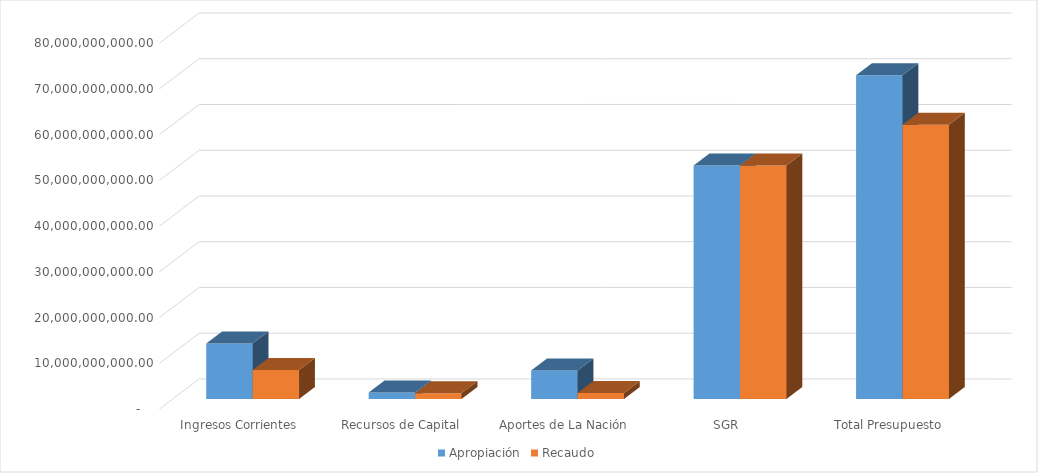
| Category | Apropiación | Recaudo |
|---|---|---|
| Ingresos Corrientes | 12114975818 | 6328537699.14 |
| Recursos de Capital | 1404411861 | 1274472946.48 |
| Aportes de La Nación | 6225627278 | 1307037370 |
| SGR | 51050367705.88 | 51050367705.88 |
| Total Presupuesto | 70795382662.88 | 59960415721.5 |